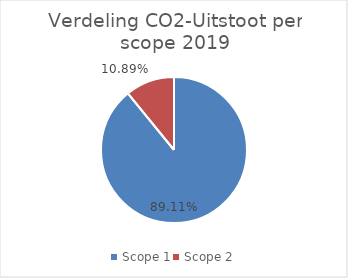
| Category | Series 0 |
|---|---|
| Scope 1 | 0.891 |
| Scope 2 | 0.109 |